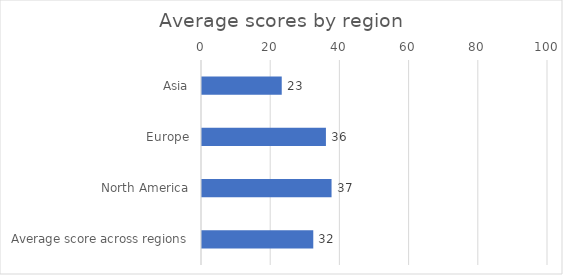
| Category | Average scores by region |
|---|---|
| Asia | 23.046 |
| Europe | 35.816 |
| North America | 37.444 |
| Average score across regions | 32.16 |